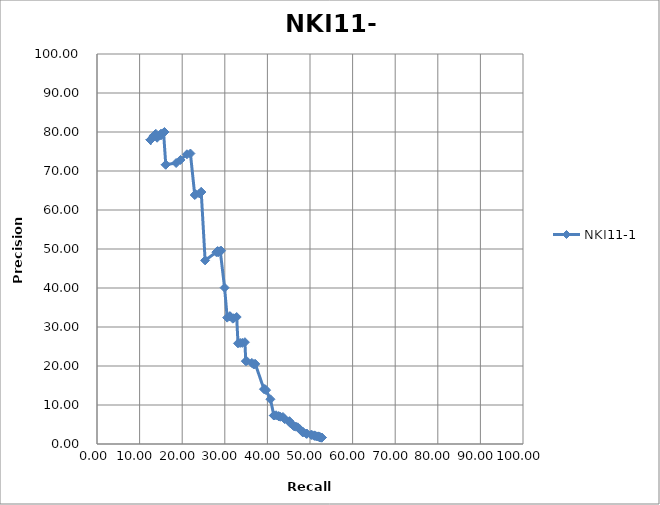
| Category | NKI11-1 |
|---|---|
| 12.589 | 77.987 |
| 12.589 | 77.987 |
| 12.589 | 77.987 |
| 12.589 | 77.987 |
| 12.589 | 77.987 |
| 12.589 | 77.987 |
| 12.589 | 77.987 |
| 13.299 | 78.916 |
| 13.299 | 78.916 |
| 13.401 | 79.042 |
| 13.604 | 79.29 |
| 13.604 | 79.29 |
| 13.604 | 79.29 |
| 13.807 | 79.532 |
| 14.112 | 78.531 |
| 14.619 | 79.121 |
| 15.025 | 79.57 |
| 15.025 | 79.144 |
| 15.635 | 79.793 |
| 15.635 | 79.793 |
| 15.838 | 80 |
| 16.142 | 71.622 |
| 16.142 | 71.622 |
| 18.579 | 72.047 |
| 19.594 | 72.83 |
| 21.117 | 74.286 |
| 21.929 | 74.483 |
| 22.944 | 63.842 |
| 23.147 | 64.045 |
| 24.061 | 64.228 |
| 24.467 | 64.611 |
| 24.467 | 64.611 |
| 25.381 | 47.081 |
| 28.02 | 49.198 |
| 28.325 | 49.468 |
| 28.426 | 49.209 |
| 28.426 | 49.209 |
| 28.934 | 49.479 |
| 29.137 | 49.568 |
| 29.949 | 40.082 |
| 30.558 | 32.4 |
| 31.168 | 32.764 |
| 31.269 | 32.731 |
| 31.878 | 32.139 |
| 32.081 | 32.245 |
| 32.792 | 32.56 |
| 33.096 | 25.812 |
| 33.604 | 25.92 |
| 34.112 | 25.926 |
| 34.721 | 26.107 |
| 34.924 | 21.235 |
| 35.127 | 21.305 |
| 36.345 | 20.79 |
| 36.751 | 20.44 |
| 36.954 | 20.461 |
| 37.157 | 20.539 |
| 39.188 | 14.062 |
| 39.391 | 14.094 |
| 39.695 | 13.811 |
| 40.711 | 11.474 |
| 41.523 | 7.304 |
| 41.523 | 7.302 |
| 42.03 | 7.367 |
| 42.64 | 7.134 |
| 42.64 | 7.103 |
| 43.046 | 6.987 |
| 43.655 | 6.921 |
| 44.061 | 6.374 |
| 45.178 | 5.854 |
| 45.279 | 5.465 |
| 45.584 | 5.253 |
| 45.99 | 4.814 |
| 46.294 | 4.51 |
| 46.701 | 4.438 |
| 47.107 | 4.278 |
| 47.614 | 3.806 |
| 48.122 | 3.193 |
| 48.325 | 3.161 |
| 48.325 | 2.953 |
| 49.137 | 2.674 |
| 49.239 | 2.675 |
| 49.239 | 2.595 |
| 50.254 | 2.364 |
| 50.457 | 2.298 |
| 51.066 | 2.217 |
| 51.066 | 2.14 |
| 51.066 | 2.092 |
| 51.472 | 1.973 |
| 51.98 | 1.962 |
| 51.98 | 1.919 |
| 51.98 | 1.919 |
| 52.183 | 1.721 |
| 52.386 | 1.704 |
| 52.386 | 1.704 |
| 52.386 | 1.704 |
| 52.487 | 1.667 |
| 52.69 | 1.649 |
| 52.69 | 1.649 |
| 52.69 | 1.649 |
| 52.69 | 1.649 |
| 52.69 | 1.649 |